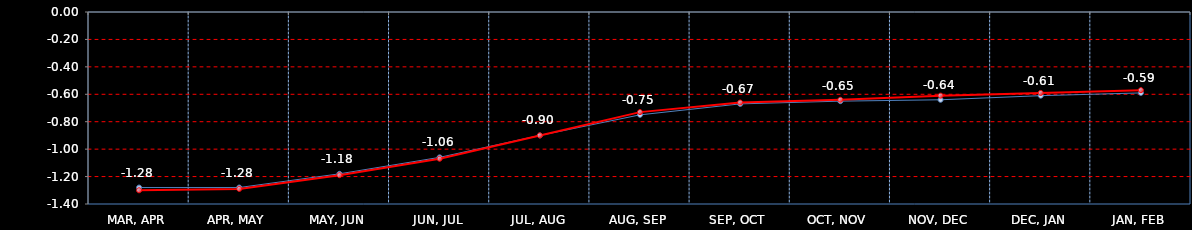
| Category | Last | Settlement | First MA | Second MA | Third MA |
|---|---|---|---|---|---|
| MAR, APR | -1.28 | -1.3 |  |  |  |
| APR, MAY | -1.28 | -1.29 |  |  |  |
| MAY, JUN | -1.18 | -1.19 |  |  |  |
| JUN, JUL | -1.06 | -1.07 |  |  |  |
| JUL, AUG | -0.9 | -0.9 |  |  |  |
| AUG, SEP | -0.75 | -0.73 |  |  |  |
| SEP, OCT | -0.67 | -0.66 |  |  |  |
| OCT, NOV | -0.65 | -0.64 |  |  |  |
| NOV, DEC | -0.64 | -0.61 |  |  |  |
| DEC, JAN | -0.61 | -0.59 |  |  |  |
| JAN, FEB | -0.59 | -0.57 |  |  |  |